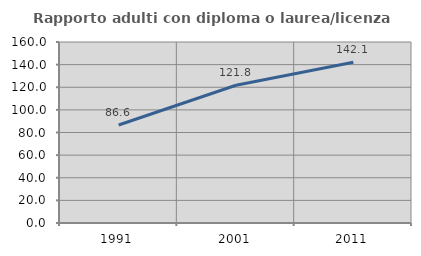
| Category | Rapporto adulti con diploma o laurea/licenza media  |
|---|---|
| 1991.0 | 86.638 |
| 2001.0 | 121.753 |
| 2011.0 | 142.09 |